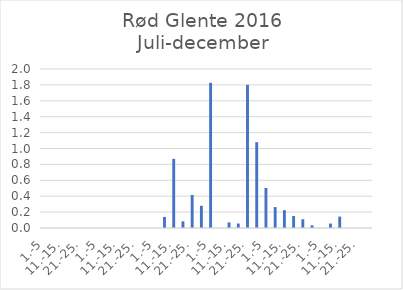
| Category | Series 0 |
|---|---|
| 1.-5 | 0 |
| 6.-10. | 0 |
| 11.-15. | 0 |
| 16.-20. | 0 |
| 21.-25. | 0 |
| 26.-31. | 0 |
| 1.-5 | 0 |
| 6.-10. | 0 |
| 11.-15. | 0 |
| 16.-20. | 0 |
| 21.-25. | 0 |
| 26.-31. | 0 |
| 1.-5 | 0 |
| 6.-10. | 0.139 |
| 11.-15. | 0.87 |
| 16.-20. | 0.084 |
| 21.-25. | 0.416 |
| 26.-30. | 0.28 |
| 1.-5 | 1.826 |
| 6.-10. | 0 |
| 11.-15. | 0.071 |
| 16.-20. | 0.056 |
| 21.-25. | 1.8 |
| 26.-31. | 1.079 |
| 1.-5 | 0.503 |
| 6.-10. | 0.263 |
| 11.-15. | 0.224 |
| 16.-20. | 0.151 |
| 21.-25. | 0.11 |
| 26.-30. | 0.033 |
| 1.-5 | 0 |
| 6.-10. | 0.056 |
| 11.-15. | 0.143 |
| 16.-20. | 0 |
| 21.-25. | 0 |
| 26.-31. | 0 |